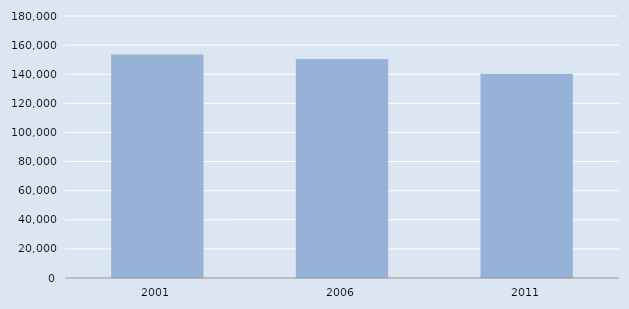
| Category | Series 0 |
|---|---|
| 2001.0 | 153530 |
| 2006.0 | 150390 |
| 2011.0 | 140310 |